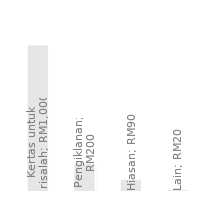
| Category | Perbelanjaan Tahunan |
|---|---|
| Kertas untuk risalah | 1000 |
| Pengiklanan | 200 |
| Hiasan | 90 |
| Lain | 20 |